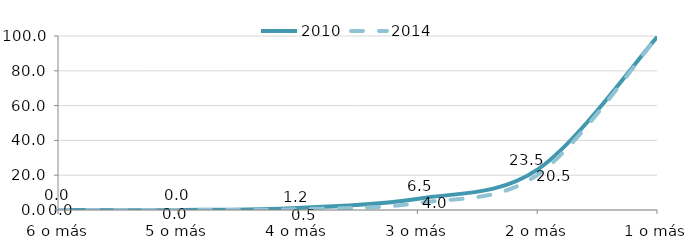
| Category | 2010 | 2014 |
|---|---|---|
| 6 o más | 0 | 0 |
| 5 o más | 0 | 0 |
| 4 o más | 1.2 | 0.5 |
| 3 o más | 6.5 | 4.012 |
| 2 o más | 23.5 | 20.5 |
| 1 o más | 100 | 100 |